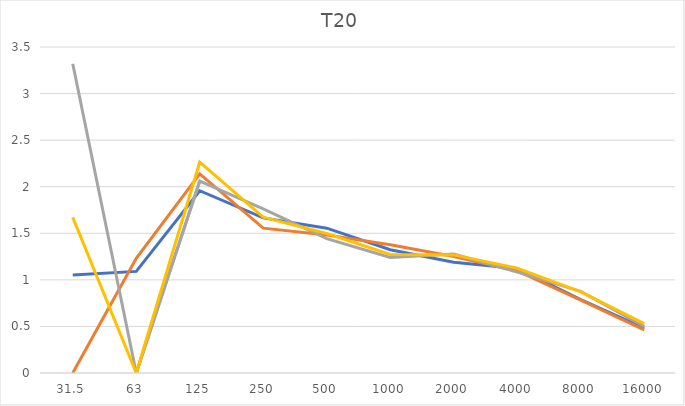
| Category | Balloon-1 | Balloon-2 | Clapper-1 | Clapper-2 |
|---|---|---|---|---|
| 31.5 | 1.053 | 0 | 3.32 | 1.671 |
| 63.0 | 1.091 | 1.232 | 0 | 0 |
| 125.0 | 1.957 | 2.138 | 2.06 | 2.263 |
| 250.0 | 1.665 | 1.555 | 1.762 | 1.673 |
| 500.0 | 1.555 | 1.482 | 1.442 | 1.497 |
| 1000.0 | 1.323 | 1.377 | 1.241 | 1.273 |
| 2000.0 | 1.188 | 1.251 | 1.277 | 1.268 |
| 4000.0 | 1.122 | 1.096 | 1.084 | 1.124 |
| 8000.0 | 0.789 | 0.782 | 0.877 | 0.871 |
| 16000.0 | 0.483 | 0.462 | 0.501 | 0.53 |